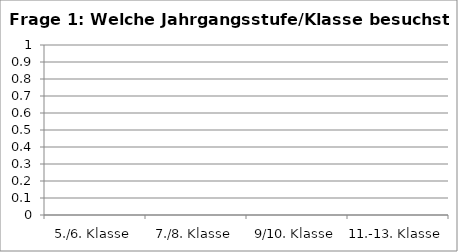
| Category | Series 0 |
|---|---|
| 5./6. Klasse | 0 |
| 7./8. Klasse | 0 |
| 9/10. Klasse | 0 |
| 11.-13. Klasse | 0 |